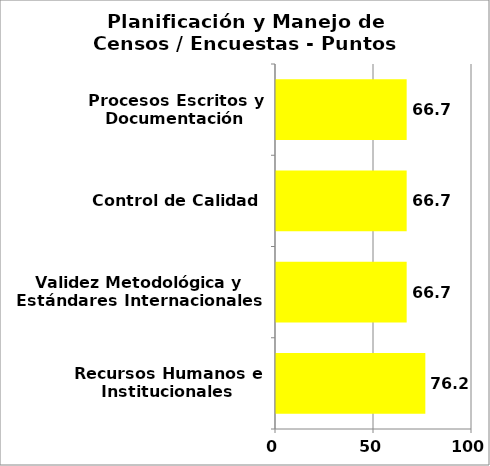
| Category | Series 0 |
|---|---|
| Recursos Humanos e Institucionales | 76.19 |
| Validez Metodológica y Estándares Internacionales | 66.667 |
| Control de Calidad | 66.667 |
| Procesos Escritos y Documentación | 66.667 |